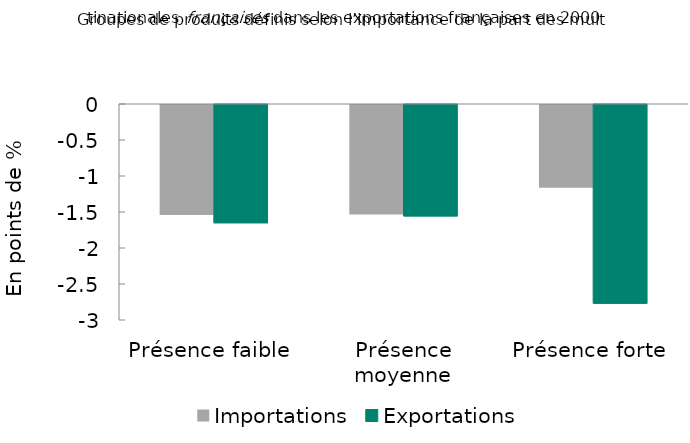
| Category | Importations | Exportations |
|---|---|---|
| Présence faible | -1.529 | -1.643 |
| Présence moyenne | -1.521 | -1.547 |
| Présence forte | -1.15 | -2.761 |